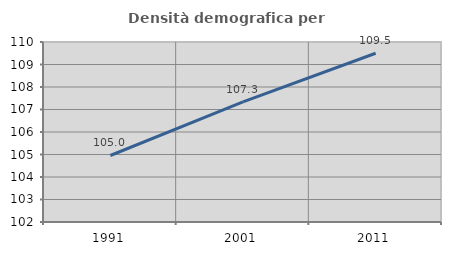
| Category | Densità demografica |
|---|---|
| 1991.0 | 104.956 |
| 2001.0 | 107.336 |
| 2011.0 | 109.5 |